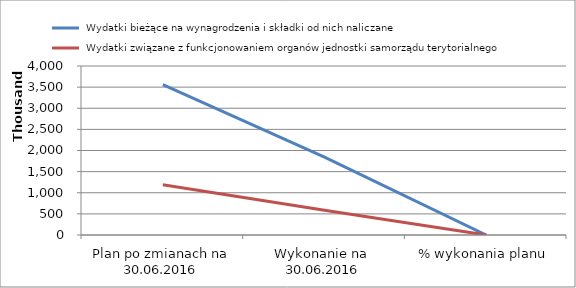
| Category |  Wydatki bieżące na wynagrodzenia i składki od nich naliczane |  Wydatki związane z funkcjonowaniem organów jednostki samorządu terytorialnego |
|---|---|---|
| Plan po zmianach na 30.06.2016 | 3559599.21 | 1188426 |
| Wykonanie na  30.06.2016 | 1845283.9 | 584660.52 |
| % wykonania planu | 0.518 | 0.492 |